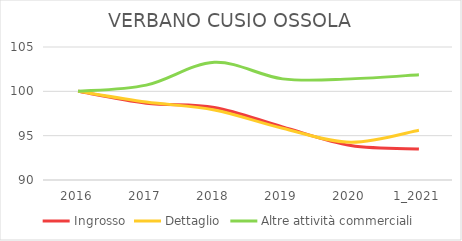
| Category | Ingrosso | Dettaglio | Altre attività commerciali |
|---|---|---|---|
| 2016 | 100 | 100 | 100 |
| 2017 | 98.663 | 98.8 | 100.703 |
| 2018 | 98.185 | 97.899 | 103.279 |
| 2019 | 95.989 | 95.836 | 101.405 |
| 2020 | 93.887 | 94.261 | 101.405 |
| 1_2021 | 93.505 | 95.611 | 101.874 |